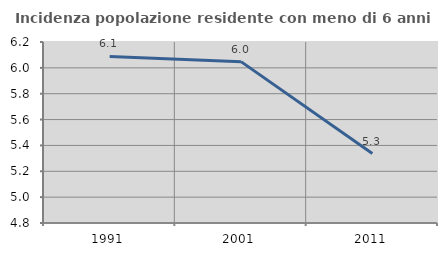
| Category | Incidenza popolazione residente con meno di 6 anni |
|---|---|
| 1991.0 | 6.088 |
| 2001.0 | 6.048 |
| 2011.0 | 5.337 |